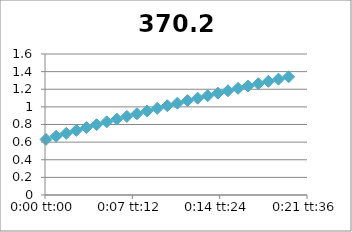
| Category | 370.2 |
|---|---|
| 5.78703703703704e-05 | 0.631 |
| 0.000636574074074074 | 0.667 |
| 0.00121527777777778 | 0.7 |
| 0.00179398148148148 | 0.733 |
| 0.00237268518518518 | 0.766 |
| 0.00295138888888889 | 0.798 |
| 0.00353009259259259 | 0.83 |
| 0.0041087962962963 | 0.861 |
| 0.0046875 | 0.892 |
| 0.0052662037037037 | 0.922 |
| 0.00584490740740741 | 0.953 |
| 0.00642361111111111 | 0.983 |
| 0.00700231481481481 | 1.013 |
| 0.00758101851851852 | 1.042 |
| 0.00815972222222222 | 1.071 |
| 0.00873842592592592 | 1.099 |
| 0.00931712962962963 | 1.127 |
| 0.00989583333333333 | 1.156 |
| 0.010474537037037 | 1.183 |
| 0.0110532407407407 | 1.21 |
| 0.0116319444444444 | 1.237 |
| 0.0122106481481481 | 1.263 |
| 0.0127893518518518 | 1.29 |
| 0.0133680555555556 | 1.315 |
| 0.0139467592592593 | 1.341 |